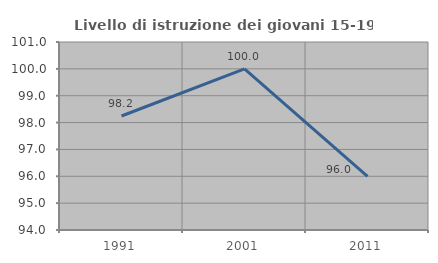
| Category | Livello di istruzione dei giovani 15-19 anni |
|---|---|
| 1991.0 | 98.246 |
| 2001.0 | 100 |
| 2011.0 | 96 |